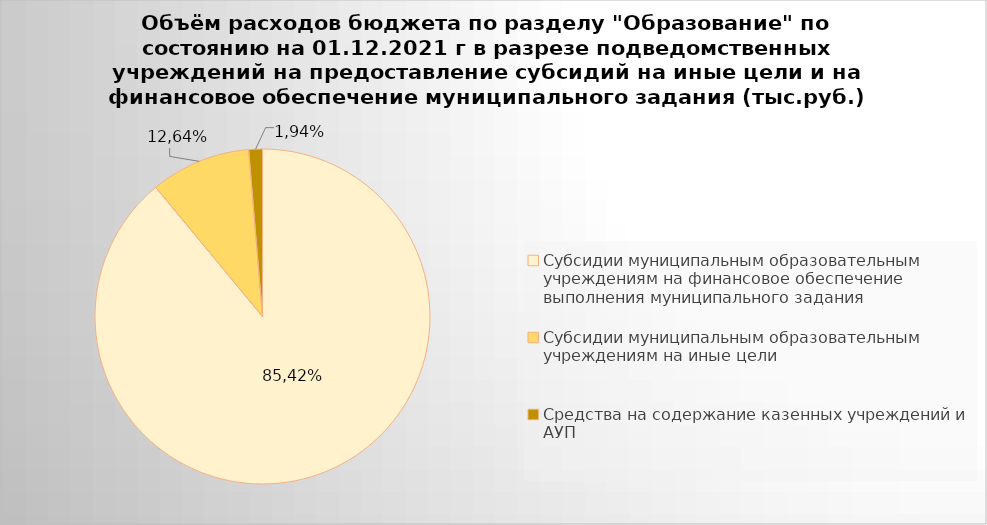
| Category | Series 0 |
|---|---|
| Субсидии муниципальным образовательным учреждениям на финансовое обеспечение выполнения муниципального задания | 6425490.57 |
| Субсидии муниципальным образовательным учреждениям на иные цели | 698816.46 |
| Средства на содержание казенных учреждений и АУП | 95158.06 |